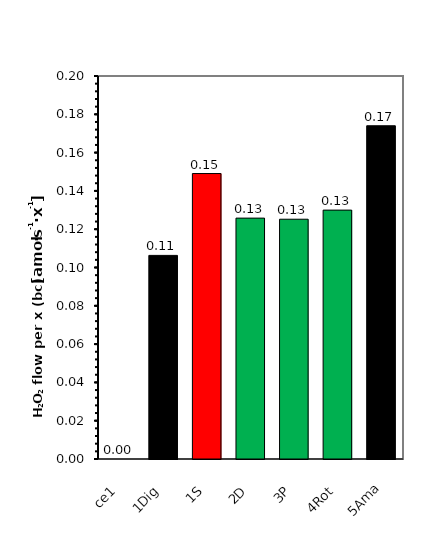
| Category | Series 0 |
|---|---|
| ce1 | 0 |
| 1Dig | 0.106 |
| 1S | 0.149 |
| 2D | 0.126 |
| 3P | 0.125 |
| 4Rot | 0.13 |
| 5Ama | 0.174 |